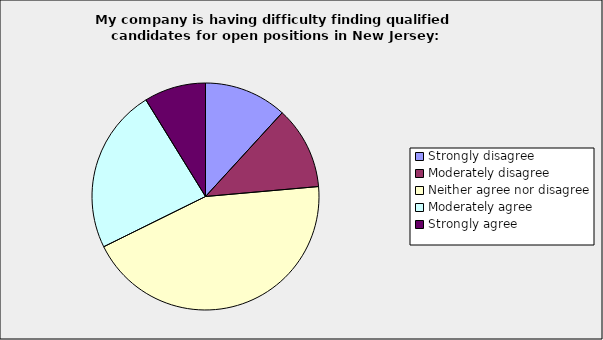
| Category | Series 0 |
|---|---|
| Strongly disagree | 0.118 |
| Moderately disagree | 0.118 |
| Neither agree nor disagree | 0.441 |
| Moderately agree | 0.235 |
| Strongly agree | 0.088 |